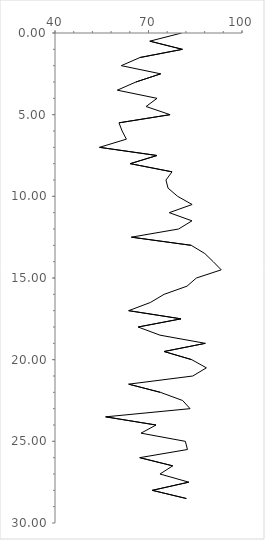
| Category | Series 0 |
|---|---|
| 80.64516129032258 | 0 |
| 70.4225352112676 | 0.5 |
| 80.88235294117648 | 1 |
| 67.27272727272727 | 1.5 |
| 61.27167630057804 | 2 |
| 73.91304347826086 | 2.5 |
| 65.95744680851064 | 3 |
| 60.0 | 3.5 |
| 72.72727272727273 | 4 |
| 69.23076923076923 | 4.5 |
| 76.92307692307693 | 5 |
| 60.526315789473685 | 5.5 |
| 61.53846153846154 | 6 |
| 62.903225806451616 | 6.5 |
| 54.285714285714285 | 7 |
| 72.72727272727273 | 7.5 |
| 64.15094339622641 | 8 |
| 77.55102040816327 | 8.5 |
| 75.60975609756098 | 9 |
| 76.27118644067797 | 9.5 |
| 79.34782608695652 | 10 |
| 84.0 | 10.5 |
| 76.66666666666667 | 11 |
| 83.9506172839506 | 11.5 |
| 79.66101694915254 | 12 |
| 64.51612903225806 | 12.5 |
| 83.72093023255815 | 13 |
| 88.05970149253731 | 13.5 |
| 90.76923076923077 | 14 |
| 93.33333333333333 | 14.5 |
| 85.36585365853658 | 15 |
| 82.35294117647058 | 15.5 |
| 75.0 | 16 |
| 70.58823529411765 | 16.5 |
| 63.63636363636363 | 17 |
| 80.43478260869566 | 17.5 |
| 66.66666666666666 | 18 |
| 73.68421052631578 | 18.5 |
| 88.23529411764706 | 19 |
| 75.0 | 19.5 |
| 83.87096774193549 | 20 |
| 88.57142857142857 | 20.5 |
| 84.21052631578947 | 21 |
| 63.63636363636363 | 21.5 |
| 73.80952380952381 | 22 |
| 80.95238095238095 | 22.5 |
| 83.33333333333334 | 23 |
| 56.25 | 23.5 |
| 72.41379310344827 | 24 |
| 67.6056338028169 | 24.5 |
| 81.81818181818183 | 25 |
| 82.5 | 25.5 |
| 67.1875 | 26 |
| 77.77777777777779 | 26.5 |
| 73.68421052631578 | 27 |
| 82.92682926829268 | 27.5 |
| 71.21212121212122 | 28 |
| 82.14285714285714 | 28.5 |